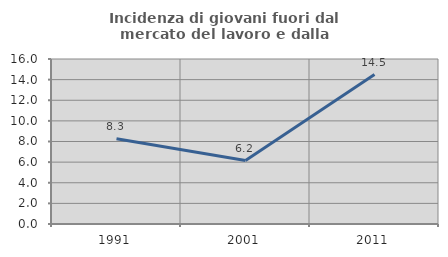
| Category | Incidenza di giovani fuori dal mercato del lavoro e dalla formazione  |
|---|---|
| 1991.0 | 8.257 |
| 2001.0 | 6.15 |
| 2011.0 | 14.493 |